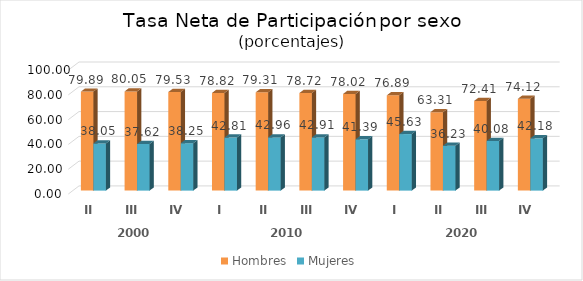
| Category | Hombres | Mujeres |
|---|---|---|
| 0 | 79.892 | 38.046 |
| 1 | 80.051 | 37.624 |
| 2 | 79.525 | 38.255 |
| 3 | 78.823 | 42.809 |
| 4 | 79.309 | 42.96 |
| 5 | 78.723 | 42.915 |
| 6 | 78.018 | 41.39 |
| 7 | 76.887 | 45.633 |
| 8 | 63.309 | 36.227 |
| 9 | 72.411 | 40.081 |
| 10 | 74.117 | 42.183 |